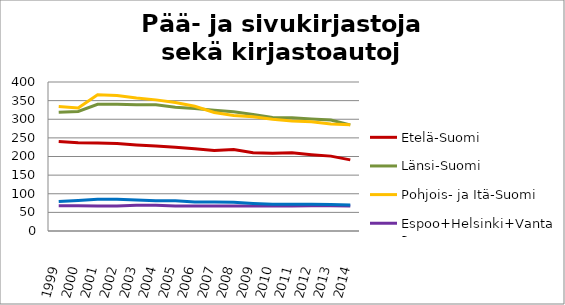
| Category | Etelä-Suomi | Länsi-Suomi | Pohjois- ja Itä-Suomi | Espoo+Helsinki+Vantaa | Muu Uusimaa |
|---|---|---|---|---|---|
| 1999.0 | 240 | 319 | 334 | 68 | 79 |
| 2000.0 | 237 | 321 | 330 | 68 | 82 |
| 2001.0 | 236 | 340 | 366 | 67 | 85 |
| 2002.0 | 235 | 340 | 364 | 67 | 85 |
| 2003.0 | 231 | 339 | 357 | 69 | 83 |
| 2004.0 | 228 | 339 | 352 | 69 | 81 |
| 2005.0 | 225 | 332 | 345 | 67 | 81 |
| 2006.0 | 221 | 329 | 335 | 67 | 78 |
| 2007.0 | 216 | 324 | 318 | 67 | 78 |
| 2008.0 | 219 | 320 | 310 | 67 | 77 |
| 2009.0 | 210 | 313 | 307 | 67 | 74 |
| 2010.0 | 209 | 305 | 300 | 67 | 72 |
| 2011.0 | 210 | 304 | 295 | 67 | 72 |
| 2012.0 | 205 | 301 | 293 | 68 | 72 |
| 2013.0 | 201 | 298 | 287 | 68 | 71 |
| 2014.0 | 191 | 285 | 285 | 67 | 70 |